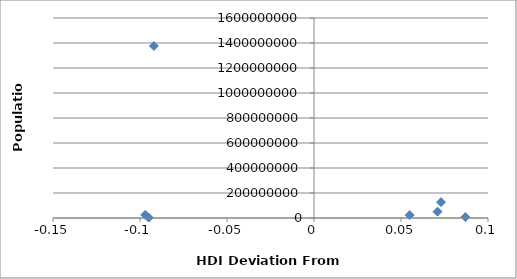
| Category | Series 0 |
|---|---|
| -0.09199999999999997 | 1376049000 |
| 0.08700000000000008 | 7234800 |
| 0.07300000000000006 | 126919659 |
| -0.09699999999999998 | 24895000 |
| 0.07100000000000006 | 50801405 |
| -0.09499999999999997 | 3081677 |
| 0.05500000000000005 | 23476640 |